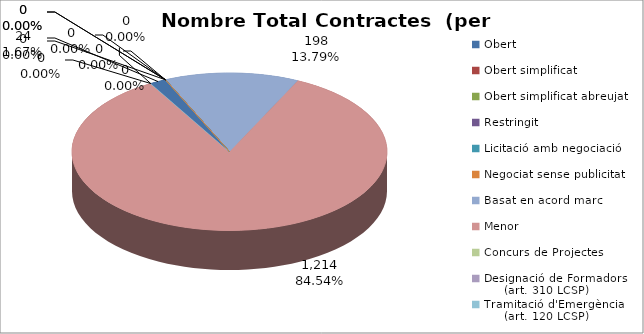
| Category | Nombre Total Contractes |
|---|---|
| Obert | 24 |
| Obert simplificat | 0 |
| Obert simplificat abreujat | 0 |
| Restringit | 0 |
| Licitació amb negociació | 0 |
| Negociat sense publicitat | 0 |
| Basat en acord marc | 198 |
| Menor | 1214 |
| Concurs de Projectes | 0 |
| Designació de Formadors
     (art. 310 LCSP) | 0 |
| Tramitació d'Emergència
     (art. 120 LCSP) | 0 |